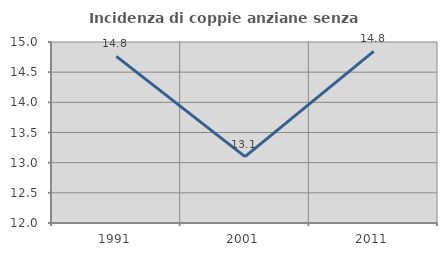
| Category | Incidenza di coppie anziane senza figli  |
|---|---|
| 1991.0 | 14.762 |
| 2001.0 | 13.1 |
| 2011.0 | 14.844 |